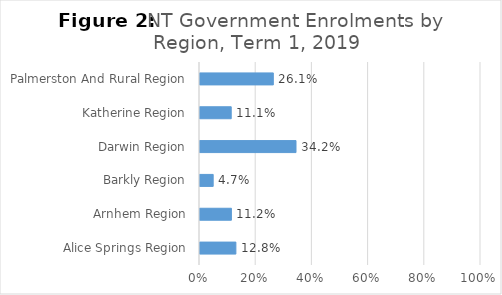
| Category | Term 1 Enrolment |
|---|---|
| Alice Springs Region | 0.128 |
| Arnhem Region | 0.112 |
| Barkly Region | 0.047 |
| Darwin Region | 0.342 |
| Katherine Region | 0.111 |
| Palmerston And Rural Region | 0.261 |